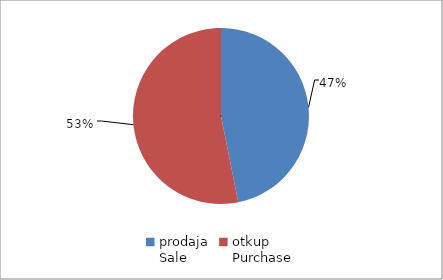
| Category | Series 0 |
|---|---|
| prodaja
Sale | 103829716.8 |
| otkup
Purchase | 117788123.93 |